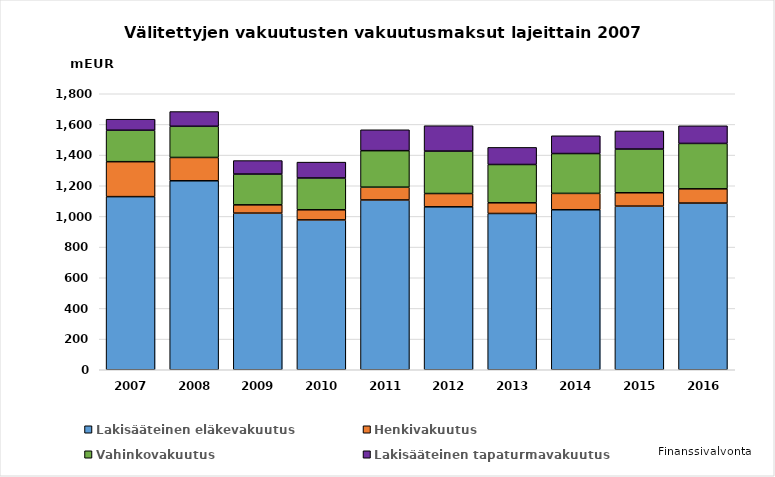
| Category | Lakisääteinen eläkevakuutus | Henkivakuutus | Vahinkovakuutus | Lakisääteinen tapaturmavakuutus |
|---|---|---|---|---|
| 2007.0 | 1129 | 228 | 205 | 72 |
| 2008.0 | 1232.449 | 151.996 | 203.425 | 95.962 |
| 2009.0 | 1021.457 | 54.107 | 200.56 | 88.041 |
| 2010.0 | 977.321 | 65.95 | 207.341 | 103.558 |
| 2011.0 | 1107.329 | 83.403 | 238.041 | 136.289 |
| 2012.0 | 1062.705 | 86.597 | 276.62 | 165.706 |
| 2013.0 | 1019.216 | 69.648 | 249.823 | 111.515 |
| 2014.0 | 1043.573 | 106.619 | 259.835 | 115.957 |
| 2015.0 | 1067.062 | 87.285 | 284.943 | 118.153 |
| 2016.0 | 1087 | 93 | 296 | 115 |